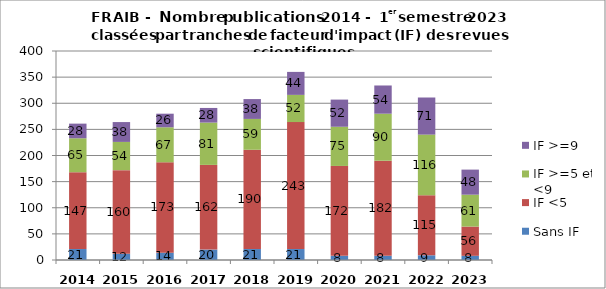
| Category | Sans IF | IF <5 | IF >=5 et <9  | IF >=9 |
|---|---|---|---|---|
| 2014.0 | 21 | 147 | 65 | 28 |
| 2015.0 | 12 | 160 | 54 | 38 |
| 2016.0 | 14 | 173 | 67 | 26 |
| 2017.0 | 20 | 162 | 81 | 28 |
| 2018.0 | 21 | 190 | 59 | 38 |
| 2019.0 | 21 | 243 | 52 | 44 |
| 2020.0 | 8 | 172 | 75 | 52 |
| 2021.0 | 8 | 182 | 90 | 54 |
| 2022.0 | 9 | 115 | 116 | 71 |
| 2023.0 | 8 | 56 | 61 | 48 |